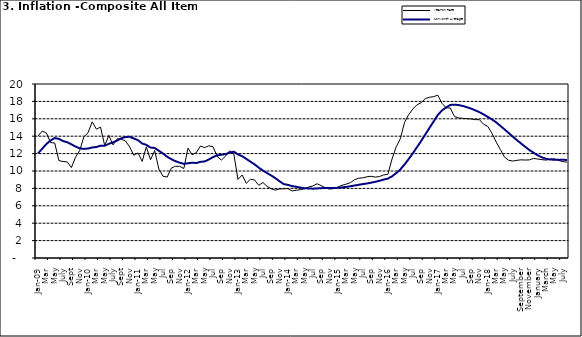
| Category | Year-on Rate | 12-Month Average |
|---|---|---|
| Jan-09 | 14.034 | 12.032 |
| Feb | 14.584 | 12.567 |
| Mar | 14.366 | 13.101 |
| Apr | 13.268 | 13.51 |
| May | 13.212 | 13.787 |
| June | 11.194 | 13.694 |
| July | 11.09 | 13.437 |
| Aug | 11.046 | 13.307 |
| Sept | 10.39 | 13.065 |
| Oct | 11.588 | 12.803 |
| Nov | 12.368 | 12.609 |
| Dec | 13.93 | 12.538 |
| Jan-10 | 14.398 | 12.586 |
| Feb | 15.649 | 12.7 |
| Mar | 14.812 | 12.757 |
| Apr | 15.044 | 12.915 |
| May | 12.915 | 12.893 |
| June | 14.099 | 13.132 |
| July | 13.002 | 13.284 |
| Aug | 13.702 | 13.5 |
| Sept | 13.65 | 13.764 |
| Oct | 13.45 | 13.908 |
| Nov | 12.766 | 13.928 |
| Dec | 11.815 | 13.74 |
| Jan-11 | 12.08 | 13.542 |
| Feb | 11.1 | 13.161 |
| Mar | 12.779 | 13.001 |
| Apr | 11.291 | 12.694 |
| May | 12.352 | 12.648 |
| Jun | 10.23 | 12.321 |
| Jul | 9.397 | 12.009 |
| Aug | 9.301 | 11.635 |
| Sep | 10.339 | 11.363 |
| Oct | 10.544 | 11.13 |
| Nov | 10.54 | 10.952 |
| Dec | 10.283 | 10.826 |
| Jan-12 | 12.626 | 10.886 |
| Feb | 11.866 | 10.955 |
| Mar | 12.111 | 10.914 |
| Apr | 12.866 | 11.054 |
| May | 12.688 | 11.096 |
| Jun | 12.892 | 11.32 |
| Jul | 12.797 | 11.599 |
| Aug | 11.689 | 11.791 |
| Sep | 11.253 | 11.859 |
| Oct | 11.693 | 11.948 |
| Nov | 12.32 | 12.091 |
| Dec | 11.981 | 12.224 |
| Jan-13 | 9.031 | 11.908 |
| Feb | 9.542 | 11.703 |
| Mar | 8.593 | 11.394 |
| Apr | 9.052 | 11.072 |
| May | 8.964 | 10.761 |
| Jun | 8.353 | 10.383 |
| Jul | 8.682 | 10.047 |
| Aug | 8.231 | 9.761 |
| Sep | 7.952 | 9.486 |
| Oct | 7.807 | 9.167 |
| Nov | 7.931 | 8.815 |
| Dec | 7.957 | 8.496 |
| Jan-14 | 7.977 | 8.408 |
| Feb | 7.707 | 8.257 |
| Mar | 7.783 | 8.19 |
| Apr | 7.851 | 8.092 |
| May | 7.965 | 8.012 |
| Jun | 8.167 | 7.998 |
| Jul | 8.281 | 7.968 |
| Aug | 8.534 | 7.996 |
| Sep | 8.317 | 8.027 |
| Oct | 8.06 | 8.047 |
| Nov | 7.927 | 8.046 |
| Dec | 7.978 | 8.047 |
| Jan-15 | 8.157 | 8.063 |
| Feb | 8.359 | 8.117 |
| Mar | 8.494 | 8.176 |
| Apr | 8.655 | 8.243 |
| May | 9.003 | 8.331 |
| Jun | 9.168 | 8.417 |
| Jul | 9.218 | 8.497 |
| Aug | 9.336 | 8.566 |
| Sep | 9.394 | 8.658 |
| Oct | 9.296 | 8.76 |
| Nov | 9.368 | 8.879 |
| Dec | 9.554 | 9.009 |
| Jan-16 | 9.617 | 9.13 |
| Feb | 11.379 | 9.386 |
| Mar | 12.775 | 9.751 |
| Apr | 13.721 | 10.182 |
| May | 15.577 | 10.746 |
| Jun | 16.48 | 11.372 |
| Jul | 17.127 | 12.045 |
| Aug | 17.609 | 12.744 |
| Sep | 17.852 | 13.454 |
| Oct | 18.33 | 14.206 |
| Nov | 18.476 | 14.958 |
| Dec | 18.547 | 15.697 |
| Jan-17 | 18.719 | 16.441 |
| Feb | 17.78 | 16.958 |
| Mar | 17.256 | 17.315 |
| Apr | 17.244 | 17.591 |
| May | 16.251 | 17.628 |
| Jun | 16.098 | 17.578 |
| Jul | 16.053 | 17.475 |
| Aug | 16.012 | 17.331 |
| Sep | 15.979 | 17.17 |
| Oct | 15.905 | 16.968 |
| Nov | 15.901 | 16.76 |
| Dec | 15.372 | 16.502 |
| Jan-18 | 15.127 | 16.215 |
| Feb | 14.33 | 15.93 |
| Mar | 13.337 | 15.599 |
| Apr | 12.482 | 15.196 |
| May | 11.608 | 14.793 |
| June | 11.231 | 14.371 |
| July | 11.142 | 13.95 |
| August | 11.227 | 13.546 |
| September | 11.284 | 13.157 |
| October | 11.259 | 12.777 |
| November | 11.281 | 12.406 |
| December | 11.442 | 12.095 |
| January | 11.374 | 11.801 |
| February | 11.306 | 11.564 |
| March | 11.251 | 11.401 |
| April | 11.372 | 11.314 |
| May | 11.396 | 11.299 |
| June | 11.217 | 11.297 |
| July | 11.084 | 11.291 |
| August | 11.016 | 11.271 |